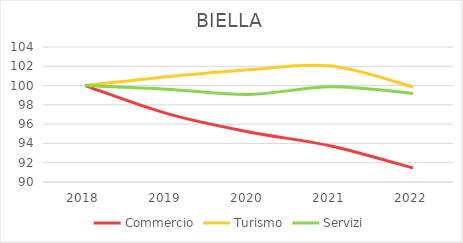
| Category | Commercio | Turismo | Servizi |
|---|---|---|---|
| 2018.0 | 100 | 100 | 100 |
| 2019.0 | 97.093 | 100.913 | 99.627 |
| 2020.0 | 95.189 | 101.631 | 99.078 |
| 2021.0 | 93.736 | 102.022 | 99.876 |
| 2022.0 | 91.443 | 99.87 | 99.184 |